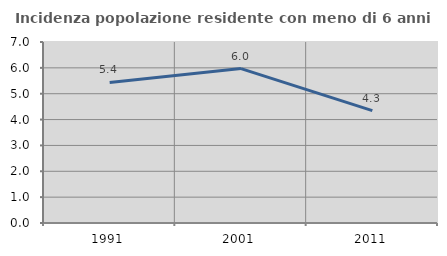
| Category | Incidenza popolazione residente con meno di 6 anni |
|---|---|
| 1991.0 | 5.438 |
| 2001.0 | 5.973 |
| 2011.0 | 4.347 |